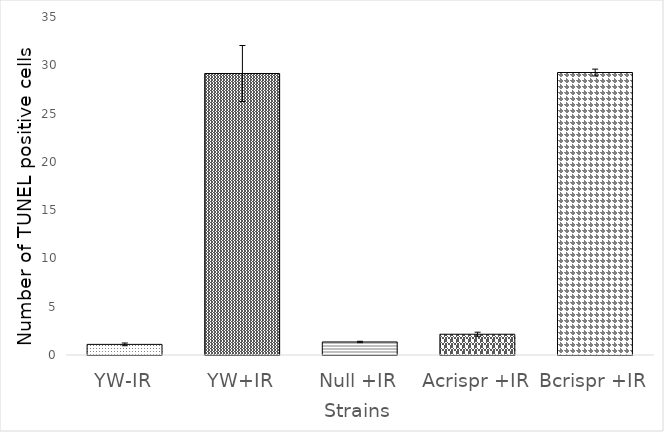
| Category | Series 0 |
|---|---|
| YW-IR | 1.1 |
| YW+IR | 29.15 |
| Null +IR | 1.35 |
| Acrispr +IR | 2.15 |
| Bcrispr +IR | 29.25 |